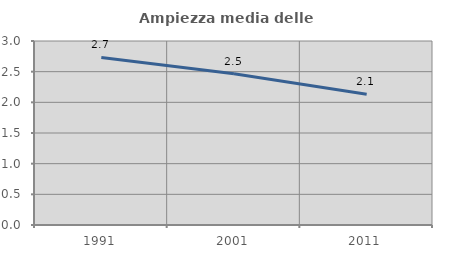
| Category | Ampiezza media delle famiglie |
|---|---|
| 1991.0 | 2.731 |
| 2001.0 | 2.465 |
| 2011.0 | 2.131 |